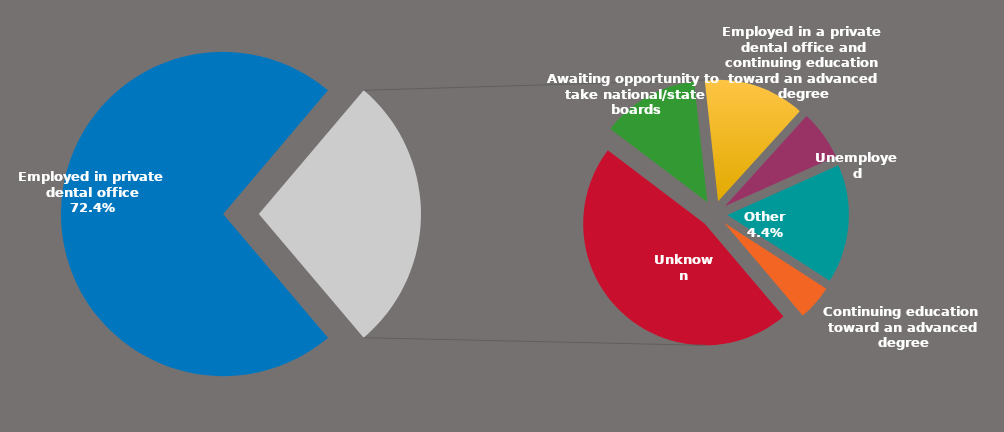
| Category | Series 0 |
|---|---|
| Employed in private dental office | 0.724 |
| Unknown | 0.128 |
| Awaiting opportunity to take national/state boards | 0.036 |
| Employed in a private dental office and continuing education toward an advanced degree | 0.037 |
| Unemployed | 0.018 |
| Other | 0.044 |
| Continuing education toward an advanced degree | 0.013 |